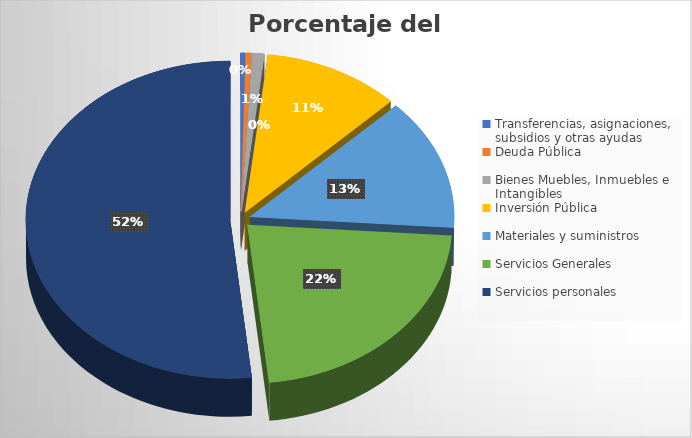
| Category | % del presupuesto |
|---|---|
| Transferencias, asignaciones, subsidios y otras ayudas | 0.371 |
| Deuda Pública | 0.468 |
| Bienes Muebles, Inmuebles e Intangibles | 0.966 |
| Inversión Pública | 10.853 |
| Materiales y suministros  | 13.425 |
| Servicios Generales | 22.224 |
| Servicios personales | 51.694 |